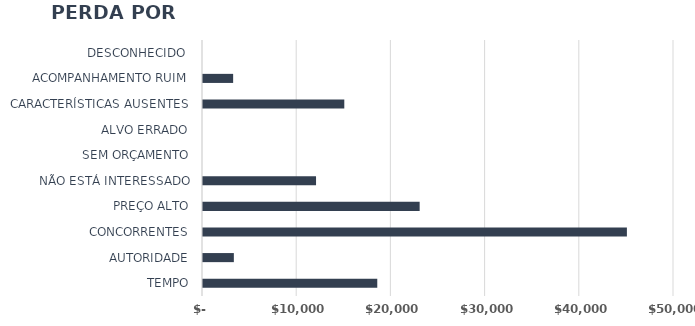
| Category | Series 1 |
|---|---|
| TEMPO | 18500 |
| AUTORIDADE | 3275 |
| CONCORRENTES | 45000 |
| PREÇO ALTO | 23000 |
| NÃO ESTÁ INTERESSADO | 12000 |
| SEM ORÇAMENTO | 0 |
| ALVO ERRADO | 0 |
| CARACTERÍSTICAS AUSENTES | 15000 |
| ACOMPANHAMENTO RUIM | 3200 |
| DESCONHECIDO  | 0 |